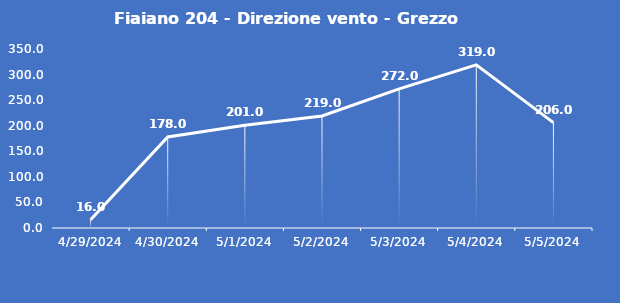
| Category | Fiaiano 204 - Direzione vento - Grezzo (°N) |
|---|---|
| 4/29/24 | 16 |
| 4/30/24 | 178 |
| 5/1/24 | 201 |
| 5/2/24 | 219 |
| 5/3/24 | 272 |
| 5/4/24 | 319 |
| 5/5/24 | 206 |